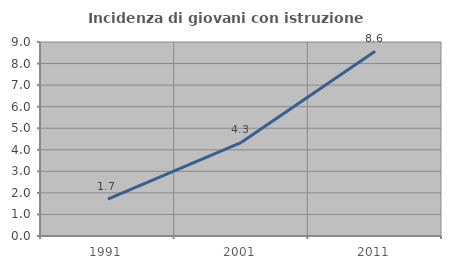
| Category | Incidenza di giovani con istruzione universitaria |
|---|---|
| 1991.0 | 1.709 |
| 2001.0 | 4.348 |
| 2011.0 | 8.566 |